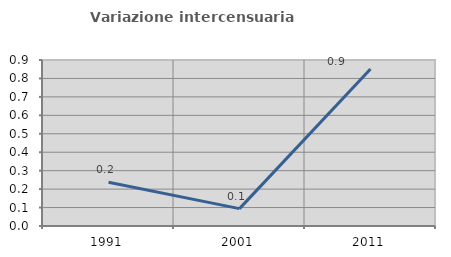
| Category | Variazione intercensuaria annua |
|---|---|
| 1991.0 | 0.237 |
| 2001.0 | 0.094 |
| 2011.0 | 0.851 |